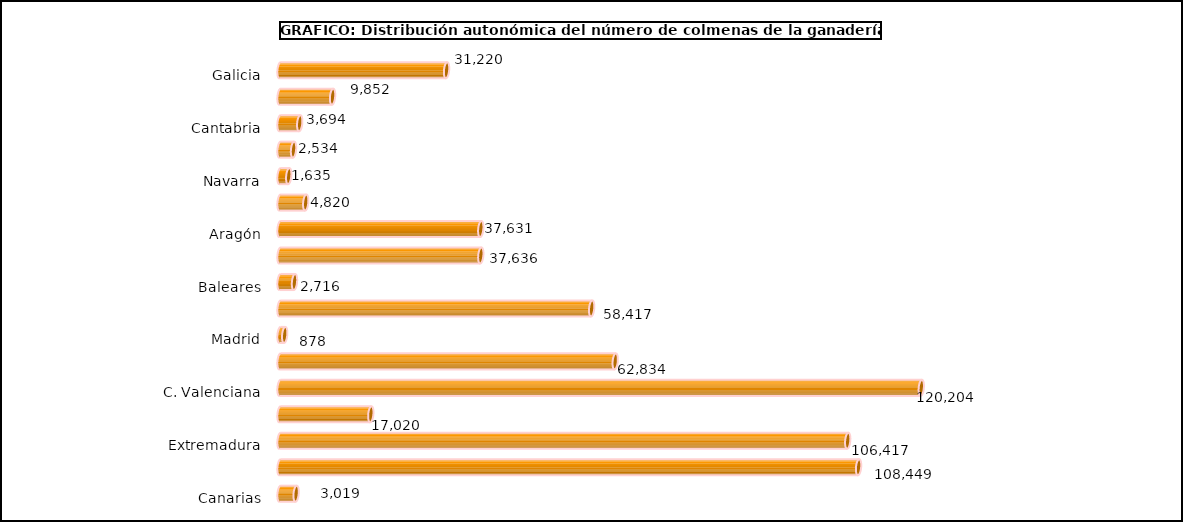
| Category | num. Animales |
|---|---|
| 0 | 31220 |
| 1 | 9852 |
| 2 | 3694 |
| 3 | 2534 |
| 4 | 1635 |
| 5 | 4820 |
| 6 | 37631 |
| 7 | 37636 |
| 8 | 2716 |
| 9 | 58417 |
| 10 | 878 |
| 11 | 62834 |
| 12 | 120204 |
| 13 | 17020 |
| 14 | 106417 |
| 15 | 108449 |
| 16 | 3019 |